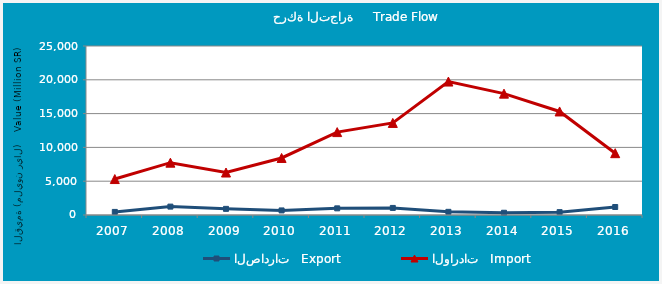
| Category | الصادرات   Export | الواردات   Import |
|---|---|---|
| 2007.0 | 456.887 | 5317.775 |
| 2008.0 | 1239.482 | 7740.482 |
| 2009.0 | 908.084 | 6283.354 |
| 2010.0 | 675.343 | 8437.497 |
| 2011.0 | 982.487 | 12263.538 |
| 2012.0 | 1046.806 | 13620.326 |
| 2013.0 | 467.488 | 19739.585 |
| 2014.0 | 332.026 | 17952.877 |
| 2015.0 | 423.83 | 15316.076 |
| 2016.0 | 1181.916 | 9144.532 |